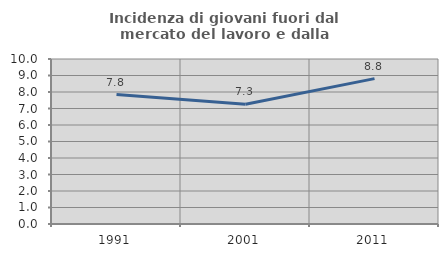
| Category | Incidenza di giovani fuori dal mercato del lavoro e dalla formazione  |
|---|---|
| 1991.0 | 7.846 |
| 2001.0 | 7.263 |
| 2011.0 | 8.811 |